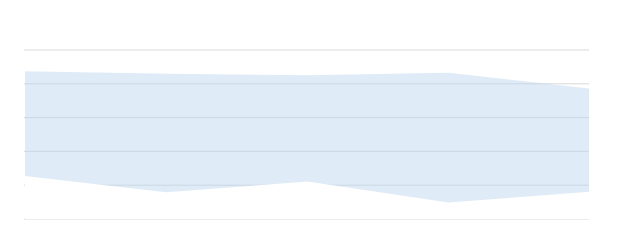
| Category | 90th percentile | 10th percentile |
|---|---|---|
| 2006.0 | 527.49 | 465.42 |
| 2009.0 | 525.991 | 455.839 |
| 2012.0 | 525.087 | 462.259 |
| 2015.0 | 526.482 | 449.691 |
| 2018.0 | 517.183 | 456.108 |